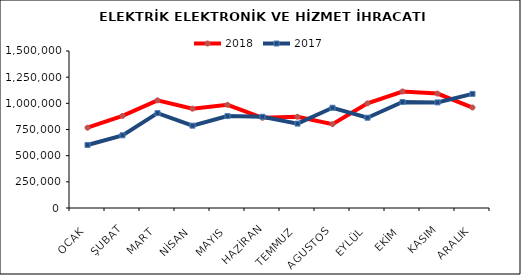
| Category | 2018 | 2017 |
|---|---|---|
| OCAK | 767149.652 | 602346.706 |
| ŞUBAT | 879691.206 | 694395.142 |
| MART | 1028302.506 | 906554.988 |
| NİSAN | 948811.306 | 786596.429 |
| MAYIS | 985792.505 | 878328.838 |
| HAZİRAN | 861762.725 | 871689.413 |
| TEMMUZ | 871348.081 | 806249.633 |
| AGUSTOS | 800901.143 | 957747.962 |
| EYLÜL | 999478.185 | 862427.642 |
| EKİM | 1113216.776 | 1012736.857 |
| KASIM | 1092979.509 | 1009048.257 |
| ARALIK | 960025.702 | 1090438.278 |